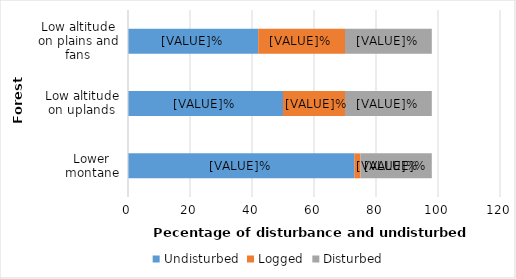
| Category | Undisturbed | Logged | Disturbed |
|---|---|---|---|
| Lower montane | 73 | 2 | 23 |
| Low altitude on uplands | 50 | 20 | 28 |
| Low altitude on plains and fans | 42 | 28 | 28 |